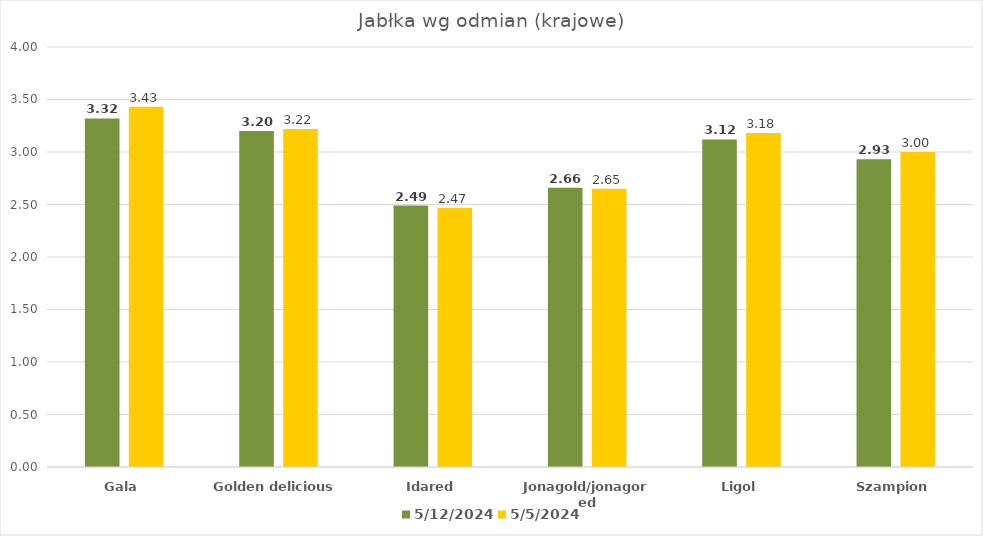
| Category | 2024-05-12 | 2024-05-05 |
|---|---|---|
| Gala | 3.32 | 3.43 |
| Golden delicious | 3.2 | 3.22 |
| Idared | 2.49 | 2.47 |
| Jonagold/jonagored | 2.66 | 2.65 |
| Ligol | 3.12 | 3.18 |
| Szampion | 2.93 | 3 |